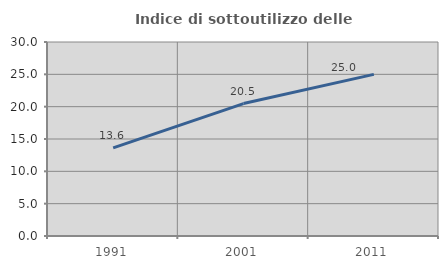
| Category | Indice di sottoutilizzo delle abitazioni  |
|---|---|
| 1991.0 | 13.638 |
| 2001.0 | 20.481 |
| 2011.0 | 24.994 |